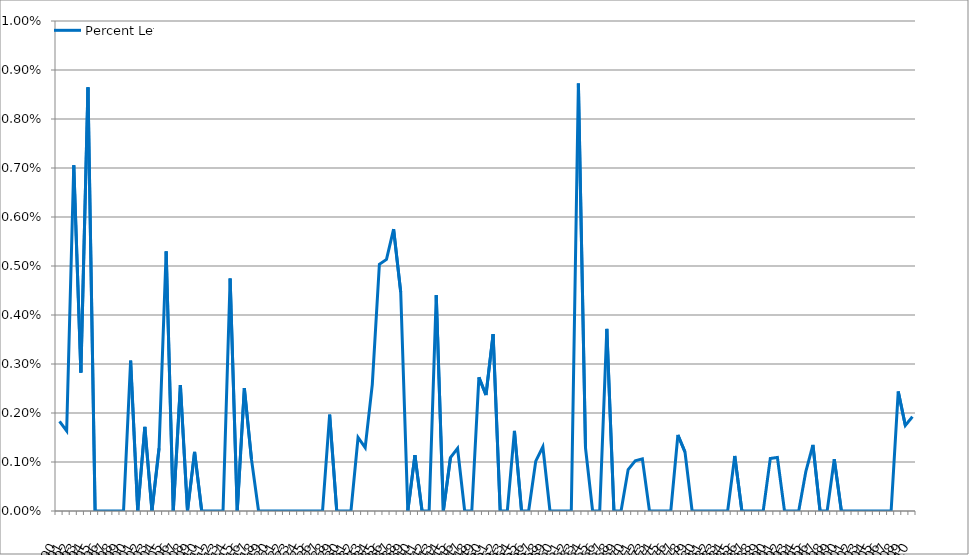
| Category | Percent Left |
|---|---|
| 1890.0 | 0.002 |
| 1891.0 | 0.002 |
| 1892.0 | 0.007 |
| 1893.0 | 0.003 |
| 1894.0 | 0.009 |
| 1895.0 | 0 |
| 1896.0 | 0 |
| 1897.0 | 0 |
| 1898.0 | 0 |
| 1899.0 | 0 |
| 1900.0 | 0.003 |
| 1901.0 | 0 |
| 1902.0 | 0.002 |
| 1903.0 | 0 |
| 1904.0 | 0.001 |
| 1905.0 | 0.005 |
| 1906.0 | 0 |
| 1907.0 | 0.003 |
| 1908.0 | 0 |
| 1909.0 | 0.001 |
| 1910.0 | 0 |
| 1911.0 | 0 |
| 1912.0 | 0 |
| 1913.0 | 0 |
| 1914.0 | 0.005 |
| 1915.0 | 0 |
| 1916.0 | 0.003 |
| 1917.0 | 0.001 |
| 1918.0 | 0 |
| 1919.0 | 0 |
| 1920.0 | 0 |
| 1921.0 | 0 |
| 1922.0 | 0 |
| 1923.0 | 0 |
| 1924.0 | 0 |
| 1925.0 | 0 |
| 1926.0 | 0 |
| 1927.0 | 0 |
| 1928.0 | 0.002 |
| 1929.0 | 0 |
| 1930.0 | 0 |
| 1931.0 | 0 |
| 1932.0 | 0.002 |
| 1933.0 | 0.001 |
| 1934.0 | 0.003 |
| 1935.0 | 0.005 |
| 1936.0 | 0.005 |
| 1937.0 | 0.006 |
| 1938.0 | 0.004 |
| 1939.0 | 0 |
| 1940.0 | 0.001 |
| 1941.0 | 0 |
| 1942.0 | 0 |
| 1943.0 | 0.004 |
| 1944.0 | 0 |
| 1945.0 | 0.001 |
| 1946.0 | 0.001 |
| 1947.0 | 0 |
| 1948.0 | 0 |
| 1949.0 | 0.003 |
| 1950.0 | 0.002 |
| 1951.0 | 0.004 |
| 1952.0 | 0 |
| 1953.0 | 0 |
| 1954.0 | 0.002 |
| 1955.0 | 0 |
| 1956.0 | 0 |
| 1957.0 | 0.001 |
| 1958.0 | 0.001 |
| 1959.0 | 0 |
| 1960.0 | 0 |
| 1961.0 | 0 |
| 1962.0 | 0 |
| 1963.0 | 0.009 |
| 1964.0 | 0.001 |
| 1965.0 | 0 |
| 1966.0 | 0 |
| 1967.0 | 0.004 |
| 1968.0 | 0 |
| 1969.0 | 0 |
| 1970.0 | 0.001 |
| 1971.0 | 0.001 |
| 1972.0 | 0.001 |
| 1973.0 | 0 |
| 1974.0 | 0 |
| 1975.0 | 0 |
| 1976.0 | 0 |
| 1977.0 | 0.002 |
| 1978.0 | 0.001 |
| 1979.0 | 0 |
| 1980.0 | 0 |
| 1981.0 | 0 |
| 1982.0 | 0 |
| 1983.0 | 0 |
| 1984.0 | 0 |
| 1985.0 | 0.001 |
| 1986.0 | 0 |
| 1987.0 | 0 |
| 1988.0 | 0 |
| 1989.0 | 0 |
| 1990.0 | 0.001 |
| 1991.0 | 0.001 |
| 1992.0 | 0 |
| 1993.0 | 0 |
| 1994.0 | 0 |
| 1995.0 | 0.001 |
| 1996.0 | 0.001 |
| 1997.0 | 0 |
| 1998.0 | 0 |
| 1999.0 | 0.001 |
| 2000.0 | 0 |
| 2001.0 | 0 |
| 2002.0 | 0 |
| 2003.0 | 0 |
| 2004.0 | 0 |
| 2005.0 | 0 |
| 2006.0 | 0 |
| 2007.0 | 0 |
| 2008.0 | 0.002 |
| 2009.0 | 0.002 |
| 2010.0 | 0.002 |